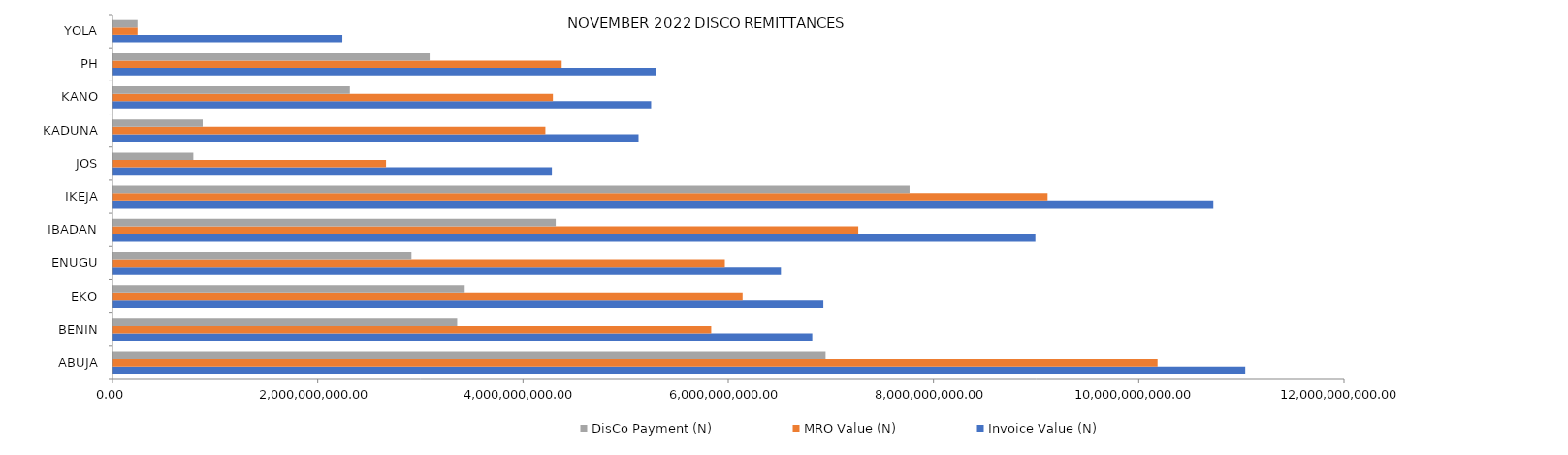
| Category | Invoice Value (N) | MRO Value (N) | DisCo Payment (N) |
|---|---|---|---|
| ABUJA | 11028372086.37 | 10173673249.676 | 6939056752.01 |
| BENIN | 6809155934.61 | 5824551986.465 | 3349134833.49 |
| EKO | 6917385517.33 | 6130187045.458 | 3422895928.72 |
| ENUGU | 6503780857.74 | 5957463265.69 | 2903629258.52 |
| IBADAN | 8983144259.79 | 7257482247.484 | 4309409529.28 |
| IKEJA | 10717196652.67 | 9102115117.113 | 7757140357.09 |
| JOS | 4271990087.29 | 2655896237.268 | 778358421.42 |
| KADUNA | 5116408107.33 | 4208757309.09 | 869109478.37 |
| KANO | 5239069022.56 | 4281891112.138 | 2303511036.3 |
| PH | 5289086638.69 | 4367727746.23 | 3080968161.26 |
| YOLA | 2230292005.43 | 234180660.57 | 234180660.57 |